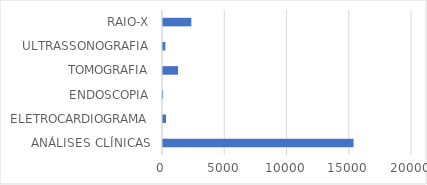
| Category | Series 0 |
|---|---|
| ANÁLISES CLÍNICAS | 15305 |
| ELETROCARDIOGRAMA | 242 |
| ENDOSCOPIA | 8 |
| TOMOGRAFIA | 1208 |
| ULTRASSONOGRAFIA | 188 |
| RAIO-X | 2275 |